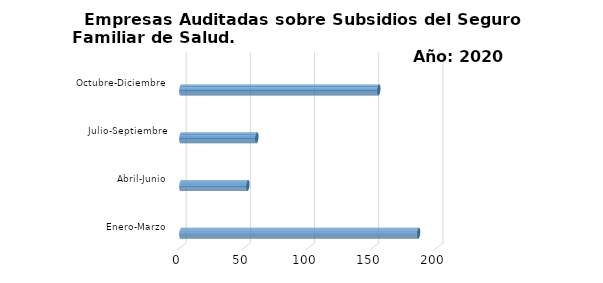
| Category | Empresas Auditadas/1 | Series 1 | Series 2 |
|---|---|---|---|
| Enero-Marzo | 185 |  |  |
| Abril-Junio | 52 |  |  |
| Julio-Septiembre | 59 |  |  |
| Octubre-Diciembre | 154 |  |  |